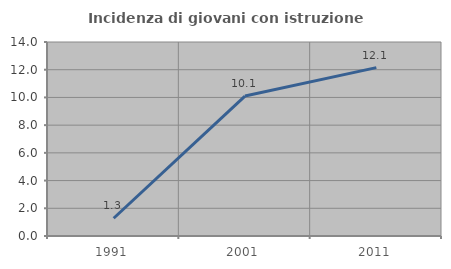
| Category | Incidenza di giovani con istruzione universitaria |
|---|---|
| 1991.0 | 1.282 |
| 2001.0 | 10.101 |
| 2011.0 | 12.15 |